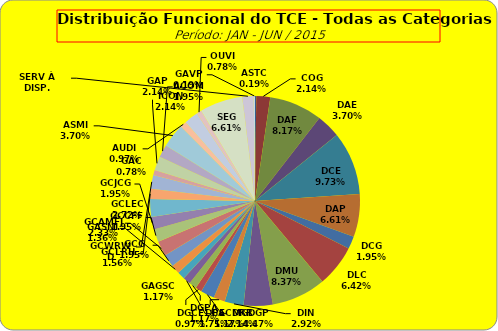
| Category | ASTC COG DAF DAE DCE DAP DCG DLC DMU DGP DIN DPE DRR DGCE DGPA GACMG GAGSC GASNI GCG GCAMFJ GCCFF GCJCG GCLEC GCLRH GCWRWD GAC GAP ACOM ASMI AUDI ICON OUVI SEG SERV À DISP. GAVP |
|---|---|
| ASTC | 1 |
| COG | 11 |
| DAF | 42 |
| DAE | 19 |
| DCE | 50 |
| DAP | 34 |
| DCG | 10 |
| DLC | 33 |
| DMU | 43 |
| DGP | 23 |
| DIN | 15 |
| DPE | 9 |
| DRR | 11 |
| DGCE | 5 |
| DGPA | 6 |
| GACMG | 6 |
| GAGSC | 6 |
| GASNI | 7 |
| GCG | 10 |
| GCAMFJ | 12 |
| GCCFF | 10 |
| GCJCG | 10 |
| GCLEC | 14 |
| GCLRH | 8 |
| GCWRWD | 11 |
| GAC | 4 |
| GAP | 11 |
| ACOM | 10 |
| ASMI | 19 |
| AUDI | 5 |
| ICON | 11 |
| OUVI | 4 |
| SEG | 34 |
| SERV À DISP. | 9 |
| GAVP | 1 |